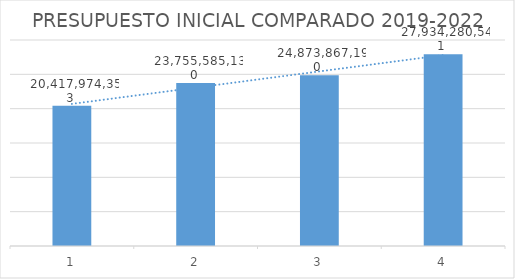
| Category | Series 0 |
|---|---|
| 0 | 20417974353 |
| 1 | 23755585130 |
| 2 | 24873867190 |
| 3 | 27934280541 |